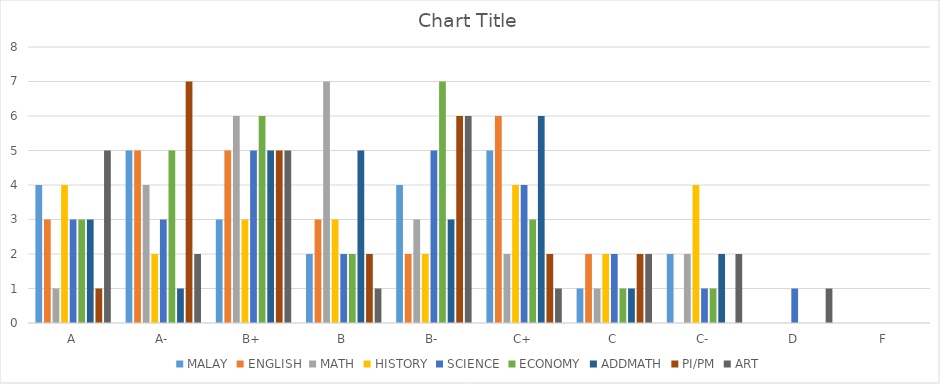
| Category | MALAY | ENGLISH | MATH | HISTORY | SCIENCE | ECONOMY | ADDMATH | PI/PM | ART |
|---|---|---|---|---|---|---|---|---|---|
| A | 4 | 3 | 1 | 4 | 3 | 3 | 3 | 1 | 5 |
| A- | 5 | 5 | 4 | 2 | 3 | 5 | 1 | 7 | 2 |
| B+ | 3 | 5 | 6 | 3 | 5 | 6 | 5 | 5 | 5 |
| B | 2 | 3 | 7 | 3 | 2 | 2 | 5 | 2 | 1 |
| B- | 4 | 2 | 3 | 2 | 5 | 7 | 3 | 6 | 6 |
| C+ | 5 | 6 | 2 | 4 | 4 | 3 | 6 | 2 | 1 |
| C | 1 | 2 | 1 | 2 | 2 | 1 | 1 | 2 | 2 |
| C- | 2 | 0 | 2 | 4 | 1 | 1 | 2 | 0 | 2 |
| D | 0 | 0 | 0 | 0 | 1 | 0 | 0 | 0 | 1 |
| F | 0 | 0 | 0 | 0 | 0 | 0 | 0 | 0 | 0 |